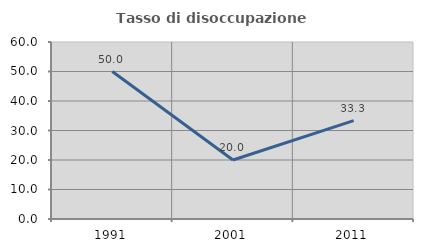
| Category | Tasso di disoccupazione giovanile  |
|---|---|
| 1991.0 | 50 |
| 2001.0 | 20 |
| 2011.0 | 33.333 |